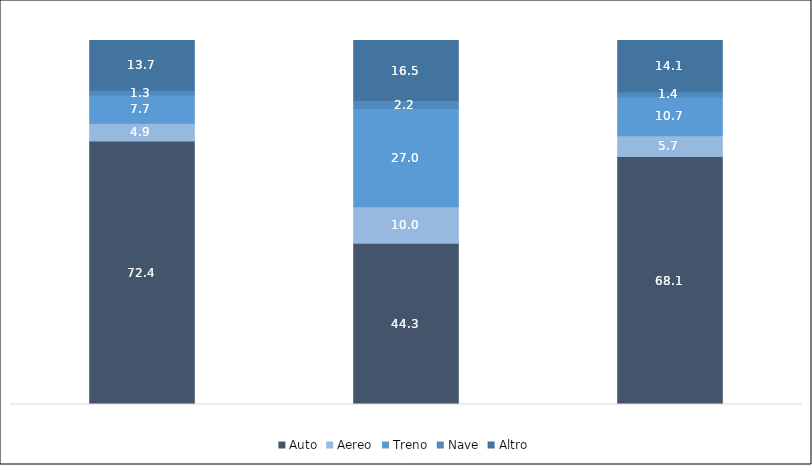
| Category | Auto | Aereo | Treno | Nave | Altro |
|---|---|---|---|---|---|
| VACANZA | 72.4 | 4.9 | 7.7 | 1.3 | 13.7 |
| LAVORO | 44.3 | 10 | 27 | 2.2 | 16.5 |
| TOTALE | 68.1 | 5.7 | 10.7 | 1.4 | 14.1 |